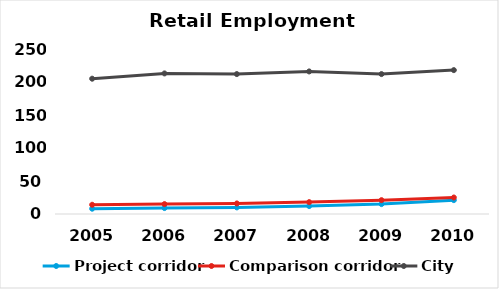
| Category | Project corridor | Comparison corridor | City |
|---|---|---|---|
| 2005.0 | 8 | 14 | 205 |
| 2006.0 | 9 | 15 | 213 |
| 2007.0 | 10 | 16 | 212 |
| 2008.0 | 12 | 18 | 216 |
| 2009.0 | 15 | 21 | 212 |
| 2010.0 | 21 | 25 | 218 |